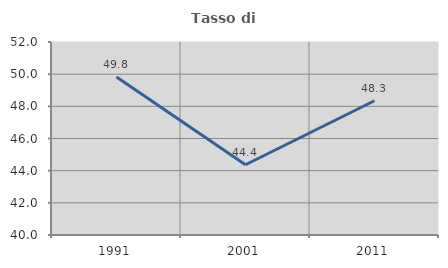
| Category | Tasso di occupazione   |
|---|---|
| 1991.0 | 49.818 |
| 2001.0 | 44.366 |
| 2011.0 | 48.348 |